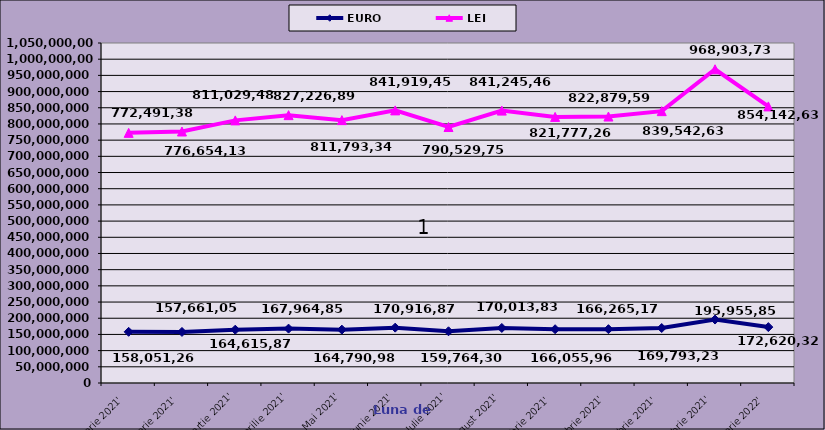
| Category | EURO | Series 1 | LEI |
|---|---|---|---|
| Ianuarie 2021' | 158051269 |  | 772491382 |
| Februarie 2021' | 157661058 |  | 776654137 |
| Martie 2021' | 164615873 |  | 811029485 |
| Aprilie 2021' | 167964852 |  | 827226896 |
| Mai 2021' | 164790983.314 |  | 811793342 |
| Iunie 2021' | 170916879 |  | 841919456 |
| Iulie 2021' | 159764305 |  | 790529757 |
| August 2021' | 170013837 |  | 841245467 |
| Septembrie 2021' | 166055964 |  | 821777260 |
| Octombrie 2021' | 166265174 |  | 822879599 |
| Noiembrie 2021' | 169793232 |  | 839542638 |
| Decembrie 2021' | 195955857 |  | 968903737 |
| Ianuarie 2022' | 172620325 |  | 854142630 |